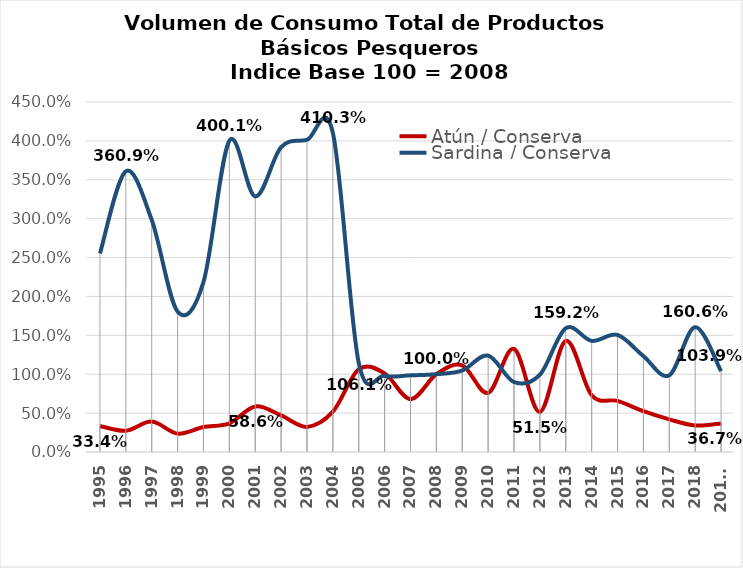
| Category | Atún / Conserva | Sardina / Conserva |
|---|---|---|
| 1995 | 0.334 | 2.552 |
| 1996 | 0.273 | 3.609 |
| 1997 | 0.391 | 2.986 |
| 1998 | 0.236 | 1.806 |
| 1999 | 0.321 | 2.185 |
| 2000 | 0.368 | 4.001 |
| 2001 | 0.586 | 3.286 |
| 2002 | 0.471 | 3.919 |
| 2003 | 0.323 | 4.013 |
| 2004 | 0.518 | 4.103 |
| 2005 | 1.061 | 1.147 |
| 2006 | 1.011 | 0.98 |
| 2007 | 0.68 | 0.986 |
| 2008 | 1 | 1 |
| 2009 | 1.115 | 1.048 |
| 2010 | 0.761 | 1.24 |
| 2011 | 1.325 | 0.899 |
| 2012 | 0.515 | 0.994 |
| 2013 | 1.43 | 1.592 |
| 2014 | 0.729 | 1.429 |
| 2015 | 0.656 | 1.505 |
| 2016 | 0.525 | 1.233 |
| 2017 | 0.42 | 0.986 |
| 2018 | 0.341 | 1.606 |
| 2019* | 0.367 | 1.039 |